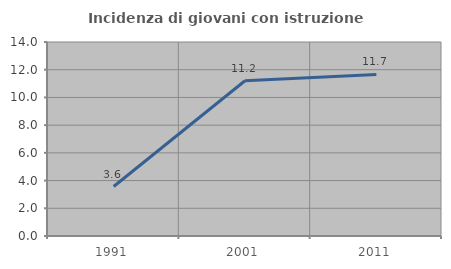
| Category | Incidenza di giovani con istruzione universitaria |
|---|---|
| 1991.0 | 3.571 |
| 2001.0 | 11.203 |
| 2011.0 | 11.656 |